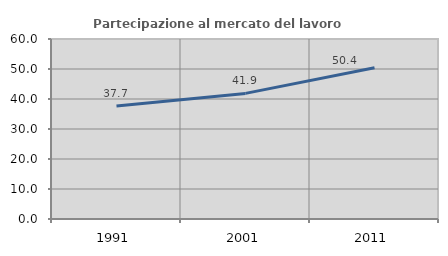
| Category | Partecipazione al mercato del lavoro  femminile |
|---|---|
| 1991.0 | 37.705 |
| 2001.0 | 41.867 |
| 2011.0 | 50.387 |